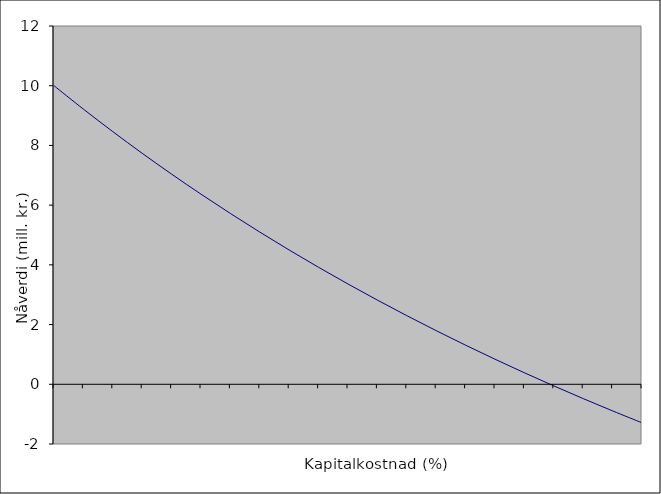
| Category | Series 0 |
|---|---|
| nan | 10 |
| 1.0 | 9.216 |
| 2.0 | 8.462 |
| 3.0 | 7.737 |
| 4.0 | 7.039 |
| 5.0 | 6.368 |
| 6.0 | 5.721 |
| 7.0 | 5.098 |
| 8.0 | 4.497 |
| 9.0 | 3.918 |
| 10.0 | 3.359 |
| 11.0 | 2.82 |
| 12.0 | 2.299 |
| 13.0 | 1.796 |
| 14.0 | 1.31 |
| 15.0 | 0.84 |
| 16.0 | 0.385 |
| 17.0 | -0.054 |
| 18.0 | -0.48 |
| 19.0 | -0.891 |
| 20.0 | -1.29 |